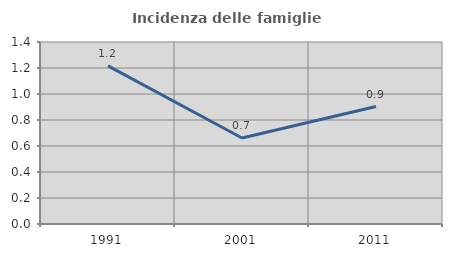
| Category | Incidenza delle famiglie numerose |
|---|---|
| 1991.0 | 1.216 |
| 2001.0 | 0.662 |
| 2011.0 | 0.903 |